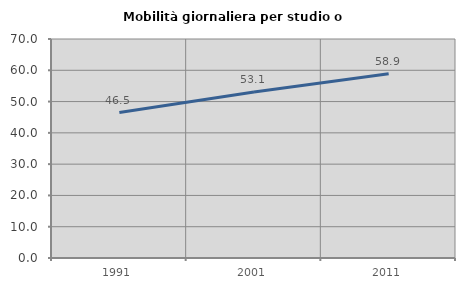
| Category | Mobilità giornaliera per studio o lavoro |
|---|---|
| 1991.0 | 46.478 |
| 2001.0 | 53.067 |
| 2011.0 | 58.902 |